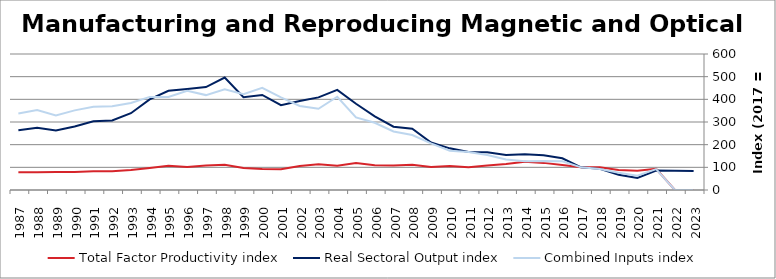
| Category | Total Factor Productivity index | Real Sectoral Output index | Combined Inputs index |
|---|---|---|---|
| 2023.0 | 0 | 83.706 | 0 |
| 2022.0 | 0 | 84.556 | 0 |
| 2021.0 | 93.629 | 86.054 | 91.909 |
| 2020.0 | 85.299 | 53.469 | 62.684 |
| 2019.0 | 88.123 | 67.38 | 76.461 |
| 2018.0 | 100.653 | 93.194 | 92.589 |
| 2017.0 | 100 | 100 | 100 |
| 2016.0 | 110.568 | 140.082 | 126.693 |
| 2015.0 | 119.657 | 153.612 | 128.377 |
| 2014.0 | 124.3 | 157.419 | 126.644 |
| 2013.0 | 114.452 | 154.076 | 134.62 |
| 2012.0 | 107.824 | 166.165 | 154.107 |
| 2011.0 | 99.865 | 167.346 | 167.571 |
| 2010.0 | 106.147 | 183.728 | 173.089 |
| 2009.0 | 101.933 | 209.45 | 205.478 |
| 2008.0 | 111.586 | 270.446 | 242.366 |
| 2007.0 | 108.22 | 279.368 | 258.148 |
| 2006.0 | 109.611 | 325.269 | 296.75 |
| 2005.0 | 118.864 | 380.649 | 320.24 |
| 2004.0 | 107.304 | 441.442 | 411.394 |
| 2003.0 | 113.952 | 408.568 | 358.543 |
| 2002.0 | 105.843 | 392.411 | 370.75 |
| 2001.0 | 91.482 | 373.914 | 408.729 |
| 2000.0 | 92.97 | 419.267 | 450.971 |
| 1999.0 | 96.864 | 409.501 | 422.76 |
| 1998.0 | 111.628 | 495.984 | 444.317 |
| 1997.0 | 108.489 | 454.255 | 418.711 |
| 1996.0 | 101.823 | 446.014 | 438.026 |
| 1995.0 | 106.62 | 437.512 | 410.348 |
| 1994.0 | 97.339 | 399.775 | 410.706 |
| 1993.0 | 88.258 | 338.699 | 383.758 |
| 1992.0 | 83.121 | 307.048 | 369.4 |
| 1991.0 | 82.494 | 303.024 | 367.33 |
| 1990.0 | 79.771 | 280.277 | 351.351 |
| 1989.0 | 79.774 | 262.535 | 329.097 |
| 1988.0 | 77.888 | 275.043 | 353.125 |
| 1987.0 | 78.002 | 263.489 | 337.797 |